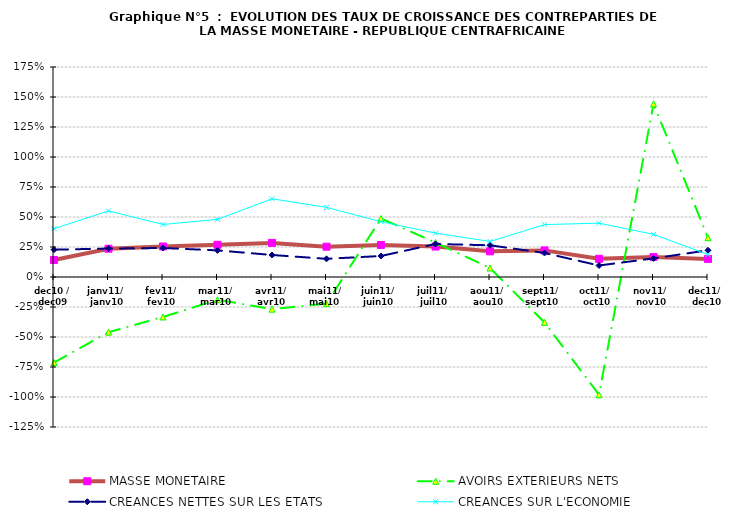
| Category | MASSE MONETAIRE | AVOIRS EXTERIEURS NETS | CREANCES NETTES SUR LES ETATS | CREANCES SUR L'ECONOMIE |
|---|---|---|---|---|
| dec10 / dec09 | 0.142 | -0.713 | 0.228 | 0.403 |
| janv11/  janv10 | 0.236 | -0.46 | 0.237 | 0.551 |
| fev11/ fev10 | 0.254 | -0.333 | 0.242 | 0.438 |
| mar11/ mar10 | 0.268 | -0.189 | 0.222 | 0.48 |
| avr11/ avr10 | 0.284 | -0.268 | 0.184 | 0.652 |
| mai11/ mai10 | 0.252 | -0.222 | 0.151 | 0.58 |
| juin11/ juin10 | 0.267 | 0.488 | 0.175 | 0.461 |
| juil11/  juil10 | 0.254 | 0.287 | 0.275 | 0.366 |
| aou11/  aou10 | 0.214 | 0.075 | 0.264 | 0.296 |
| sept11/  sept10 | 0.222 | -0.378 | 0.2 | 0.437 |
| oct11/  oct10 | 0.152 | -0.981 | 0.096 | 0.449 |
| nov11/  nov10 | 0.166 | 1.443 | 0.155 | 0.355 |
| dec11/  dec10 | 0.151 | 0.328 | 0.223 | 0.186 |